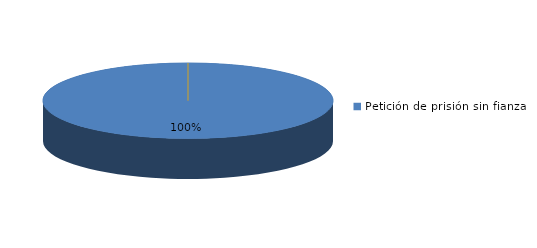
| Category | Series 0 |
|---|---|
| Petición de prisión sin fianza | 164 |
| Peticion de libertad con fianza | 0 |
| Petición de libertad | 0 |